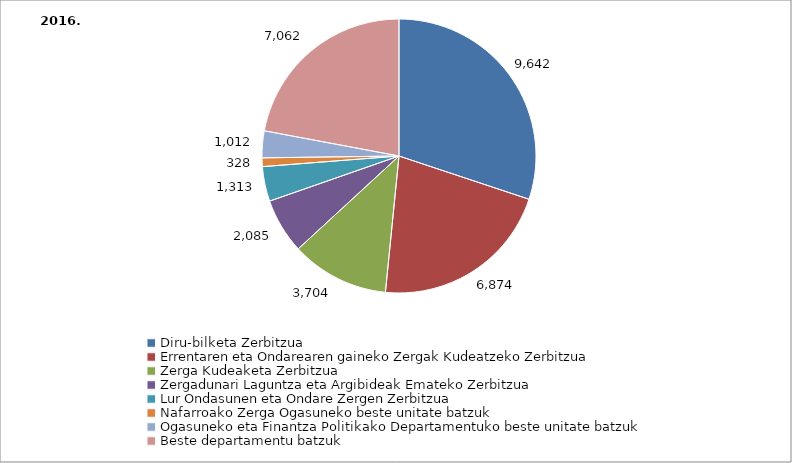
| Category | Series 0 |
|---|---|
| Diru-bilketa Zerbitzua | 9642 |
| Errentaren eta Ondarearen gaineko Zergak Kudeatzeko Zerbitzua | 6874 |
| Zerga Kudeaketa Zerbitzua | 3704 |
| Zergadunari Laguntza eta Argibideak Emateko Zerbitzua | 2085 |
| Lur Ondasunen eta Ondare Zergen Zerbitzua | 1313 |
| Nafarroako Zerga Ogasuneko beste unitate batzuk | 328 |
| Ogasuneko eta Finantza Politikako Departamentuko beste unitate batzuk | 1012 |
| Beste departamentu batzuk | 7062 |